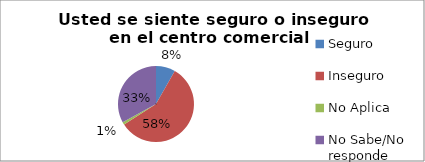
| Category | Series 0 |
|---|---|
| Seguro | 0.082 |
| Inseguro | 0.576 |
| No Aplica | 0.012 |
| No Sabe/No responde | 0.329 |